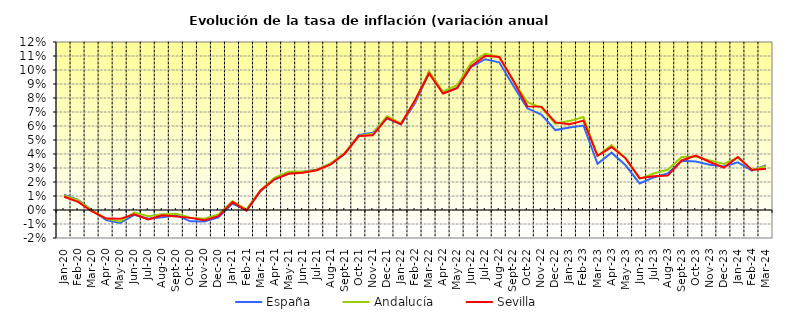
| Category | España | Andalucía | Sevilla |
|---|---|---|---|
| 2020-01-01 | 0.011 | 0.01 | 0.009 |
| 2020-02-01 | 0.007 | 0.007 | 0.006 |
| 2020-03-01 | 0 | 0 | -0.001 |
| 2020-04-01 | -0.007 | -0.006 | -0.006 |
| 2020-05-01 | -0.009 | -0.008 | -0.006 |
| 2020-06-01 | -0.003 | -0.002 | -0.003 |
| 2020-07-01 | -0.006 | -0.004 | -0.007 |
| 2020-08-01 | -0.005 | -0.003 | -0.004 |
| 2020-09-01 | -0.004 | -0.003 | -0.005 |
| 2020-10-01 | -0.008 | -0.005 | -0.006 |
| 2020-11-01 | -0.008 | -0.006 | -0.007 |
| 2020-12-01 | -0.005 | -0.003 | -0.004 |
| 2021-01-01 | 0.005 | 0.006 | 0.006 |
| 2021-02-01 | 0 | 0 | 0 |
| 2021-03-01 | 0.013 | 0.014 | 0.014 |
| 2021-04-01 | 0.022 | 0.023 | 0.022 |
| 2021-05-01 | 0.027 | 0.027 | 0.026 |
| 2021-06-01 | 0.027 | 0.027 | 0.027 |
| 2021-07-01 | 0.029 | 0.029 | 0.028 |
| 2021-08-01 | 0.033 | 0.033 | 0.033 |
| 2021-09-01 | 0.04 | 0.041 | 0.04 |
| 2021-10-01 | 0.054 | 0.053 | 0.053 |
| 2021-11-01 | 0.055 | 0.054 | 0.053 |
| 2021-12-01 | 0.065 | 0.067 | 0.066 |
| 2022-01-01 | 0.061 | 0.062 | 0.061 |
| 2022-02-01 | 0.076 | 0.078 | 0.078 |
| 2022-03-01 | 0.098 | 0.099 | 0.098 |
| 2022-04-01 | 0.083 | 0.084 | 0.083 |
| 2022-05-01 | 0.087 | 0.089 | 0.087 |
| 2022-06-01 | 0.102 | 0.105 | 0.103 |
| 2022-07-01 | 0.108 | 0.112 | 0.11 |
| 2022-08-01 | 0.105 | 0.109 | 0.109 |
| 2022-09-01 | 0.089 | 0.092 | 0.092 |
| 2022-10-01 | 0.073 | 0.077 | 0.074 |
| 2022-11-01 | 0.068 | 0.073 | 0.074 |
| 2022-12-01 | 0.057 | 0.062 | 0.063 |
| 2023-01-01 | 0.059 | 0.063 | 0.061 |
| 2023-02-01 | 0.06 | 0.066 | 0.064 |
| 2023-03-01 | 0.033 | 0.039 | 0.039 |
| 2023-04-01 | 0.041 | 0.046 | 0.045 |
| 2023-05-01 | 0.032 | 0.037 | 0.037 |
| 2023-06-01 | 0.019 | 0.022 | 0.023 |
| 2023-07-01 | 0.023 | 0.026 | 0.024 |
| 2023-08-01 | 0.026 | 0.029 | 0.025 |
| 2023-09-01 | 0.035 | 0.038 | 0.035 |
| 2023-10-01 | 0.035 | 0.038 | 0.039 |
| 2023-11-01 | 0.032 | 0.035 | 0.034 |
| 2023-12-01 | 0.031 | 0.033 | 0.03 |
| 2024-01-01 | 0.034 | 0.038 | 0.038 |
| 2024-02-01 | 0.028 | 0.029 | 0.029 |
| 2024-03-01 | 0.032 | 0.031 | 0.029 |